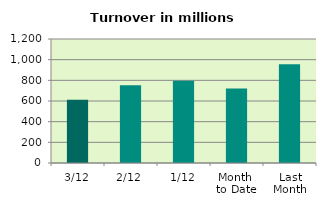
| Category | Series 0 |
|---|---|
| 3/12 | 612.519 |
| 2/12 | 753.581 |
| 1/12 | 795.529 |
| Month 
to Date | 720.543 |
| Last
Month | 954.978 |